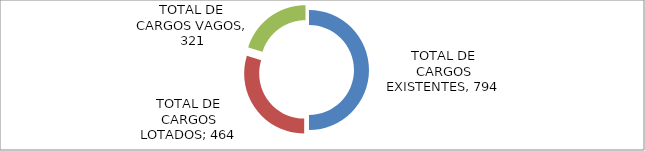
| Category | Series 0 | Series 1 |
|---|---|---|
| TOTAL DE CARGOS EXISTENTES |  | 794 |
| TOTAL DE CARGOS LOTADOS** |  | 473 |
| TOTAL DE CARGOS VAGOS |  | 321 |